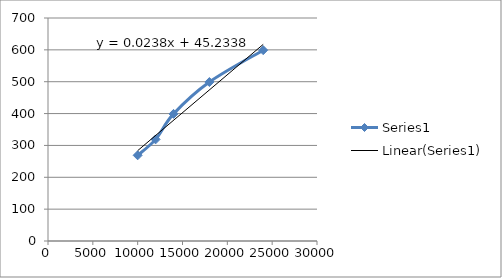
| Category | Series 0 |
|---|---|
| 10000.0 | 269 |
| 12000.0 | 319 |
| 14000.0 | 399 |
| 18000.0 | 499 |
| 24000.0 | 599 |